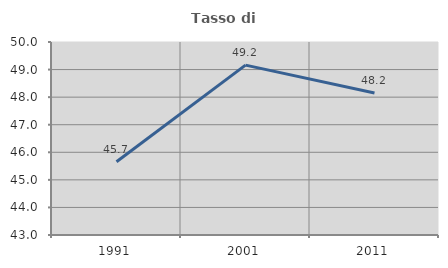
| Category | Tasso di occupazione   |
|---|---|
| 1991.0 | 45.657 |
| 2001.0 | 49.161 |
| 2011.0 | 48.151 |